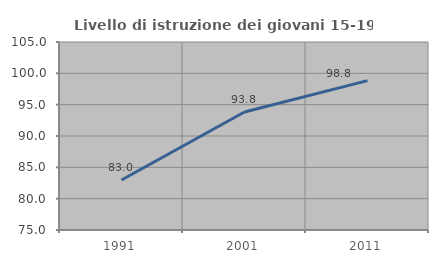
| Category | Livello di istruzione dei giovani 15-19 anni |
|---|---|
| 1991.0 | 82.979 |
| 2001.0 | 93.839 |
| 2011.0 | 98.83 |